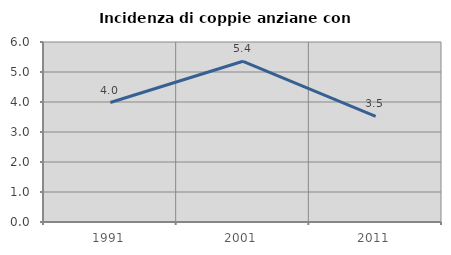
| Category | Incidenza di coppie anziane con figli |
|---|---|
| 1991.0 | 3.982 |
| 2001.0 | 5.357 |
| 2011.0 | 3.524 |